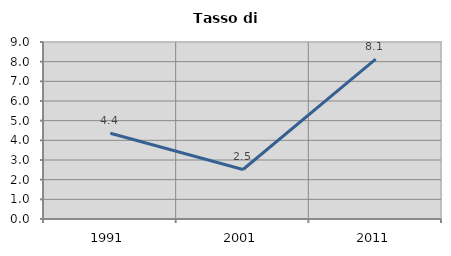
| Category | Tasso di disoccupazione   |
|---|---|
| 1991.0 | 4.362 |
| 2001.0 | 2.517 |
| 2011.0 | 8.132 |